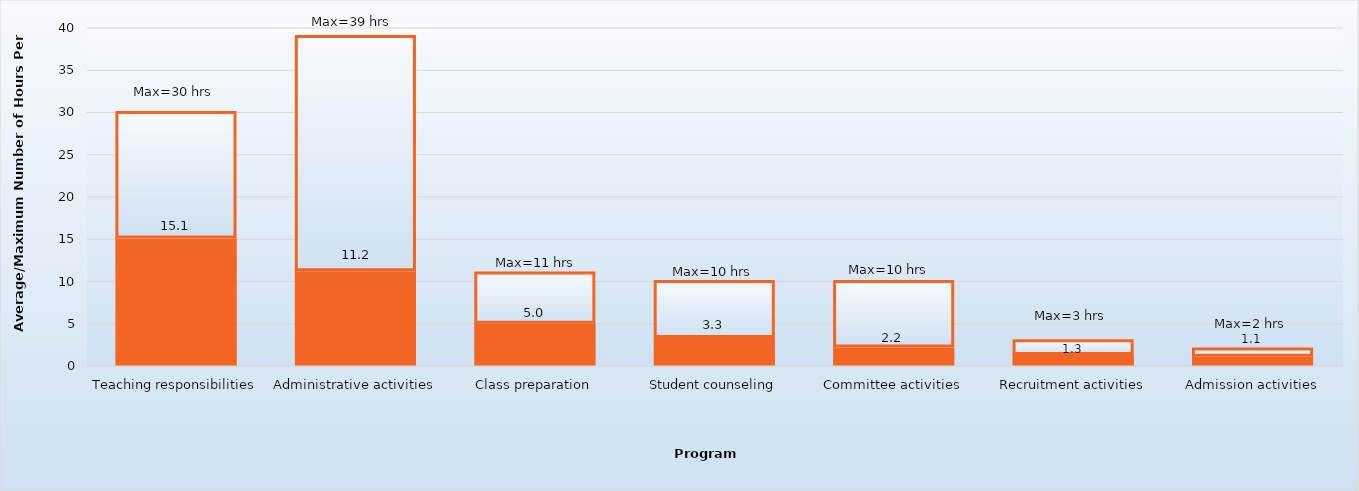
| Category | Average hours per week | Maximum |
|---|---|---|
| Teaching responsibilities | 15.1 | 14.9 |
| Administrative activities | 11.2 | 27.8 |
| Class preparation | 5 | 6 |
| Student counseling | 3.3 | 6.7 |
| Committee activities | 2.2 | 7.8 |
| Recruitment activities | 1.3 | 1.7 |
| Admission activities | 1.1 | 0.9 |